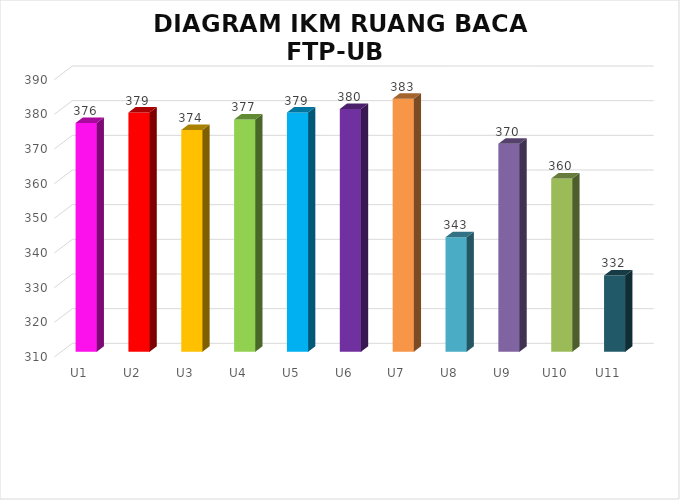
| Category | DIAGRAM IKM RUANG BACA FTP-UB TAHUN 2019 |
|---|---|
| U1 | 376 |
| U2 | 379 |
| U3 | 374 |
| U4 | 377 |
| U5 | 379 |
| U6 | 380 |
| U7 | 383 |
| U8 | 343 |
| U9 | 370 |
| U10 | 360 |
| U11 | 332 |